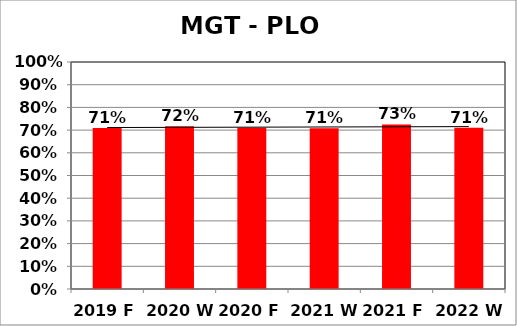
| Category | Series 0 |
|---|---|
| 2019 F | 0.709 |
| 2020 W | 0.717 |
| 2020 F | 0.71 |
| 2021 W | 0.708 |
| 2021 F | 0.725 |
| 2022 W | 0.711 |